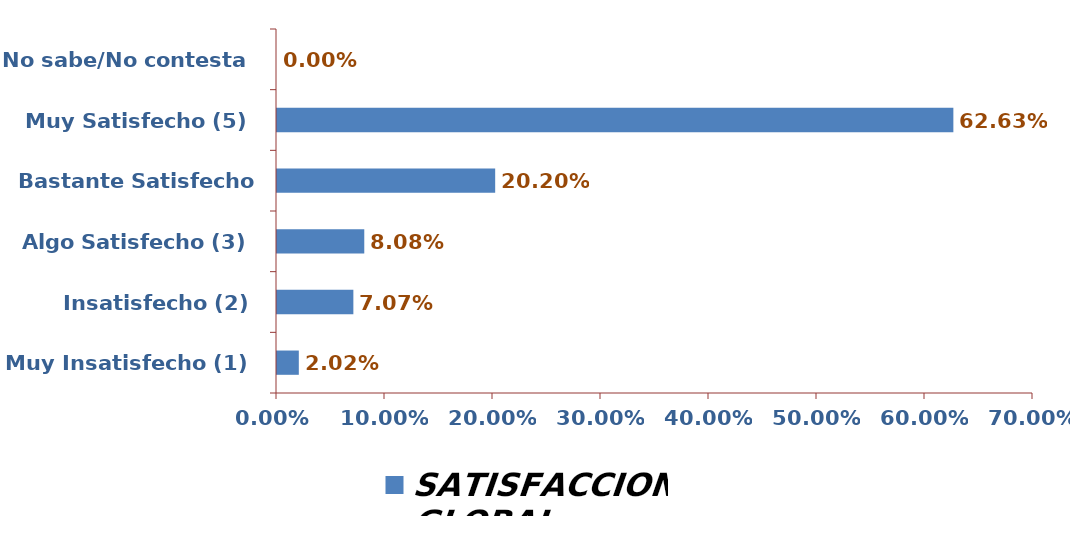
| Category | SATISFACCIÓN GLOBAL |
|---|---|
| Muy Insatisfecho (1) | 0.02 |
| Insatisfecho (2) | 0.071 |
| Algo Satisfecho (3) | 0.081 |
| Bastante Satisfecho (4) | 0.202 |
| Muy Satisfecho (5) | 0.626 |
| No sabe/No contesta | 0 |